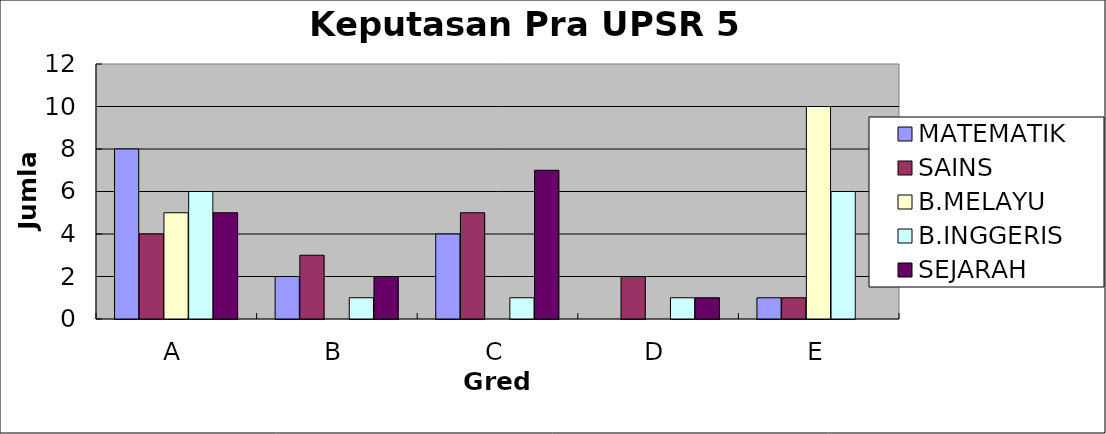
| Category | Series 0 | Series 1 | Series 2 | Series 3 | Series 4 |
|---|---|---|---|---|---|
| A | 8 | 4 | 5 | 6 | 5 |
| B | 2 | 3 | 0 | 1 | 2 |
| C | 4 | 5 | 0 | 1 | 7 |
| D | 0 | 2 | 0 | 1 | 1 |
| E | 1 | 1 | 10 | 6 | 0 |